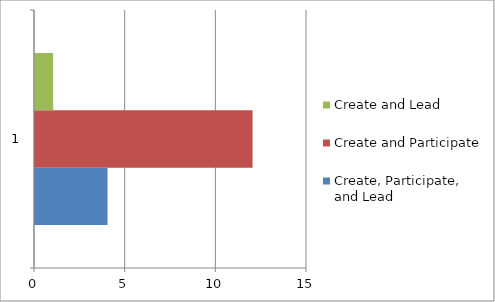
| Category | Create, Participate, and Lead | Create and Participate | Create and Lead |
|---|---|---|---|
| 0 | 4 | 12 | 1 |